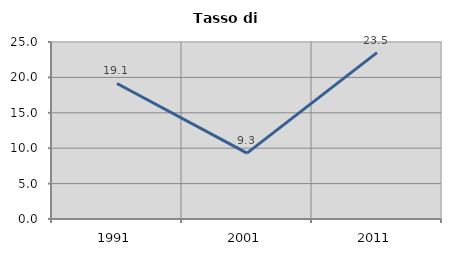
| Category | Tasso di disoccupazione   |
|---|---|
| 1991.0 | 19.145 |
| 2001.0 | 9.306 |
| 2011.0 | 23.504 |